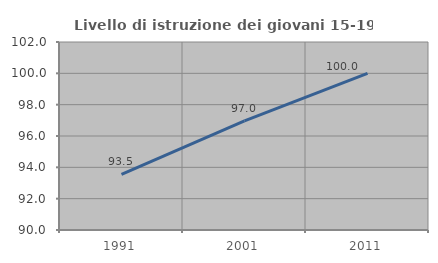
| Category | Livello di istruzione dei giovani 15-19 anni |
|---|---|
| 1991.0 | 93.548 |
| 2001.0 | 96.97 |
| 2011.0 | 100 |